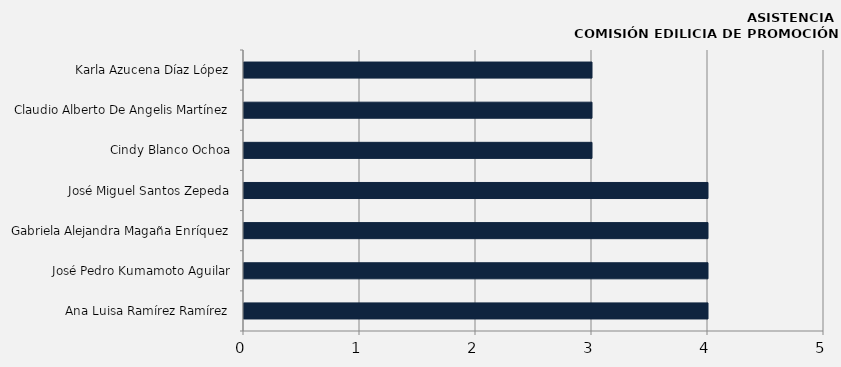
| Category | Ana Luisa Ramírez Ramírez |
|---|---|
| Ana Luisa Ramírez Ramírez | 4 |
| José Pedro Kumamoto Aguilar | 4 |
| Gabriela Alejandra Magaña Enríquez | 4 |
| José Miguel Santos Zepeda | 4 |
| Cindy Blanco Ochoa | 3 |
| Claudio Alberto De Angelis Martínez | 3 |
| Karla Azucena Díaz López | 3 |